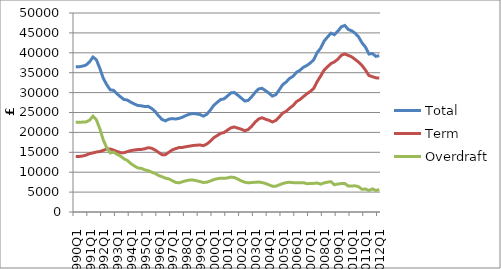
| Category | Total | Term | Overdraft |
|---|---|---|---|
| 1990Q1 | 36461.171 | 13914.215 | 22546.956 |
| 1990Q2 | 36496.002 | 13942.438 | 22553.564 |
| 1990Q3 | 36652.749 | 14069.449 | 22583.3 |
| 1990Q4 | 36931.415 | 14295.252 | 22636.163 |
| 1991Q1 | 37706.526 | 14655.279 | 23051.246 |
| 1991Q2 | 38934.619 | 14846.275 | 24088.343 |
| 1991Q3 | 38229.02 | 15078.654 | 23150.366 |
| 1991Q4 | 36060.124 | 15197.495 | 20862.629 |
| 1992Q1 | 33561.191 | 15501.479 | 18059.712 |
| 1992Q2 | 31970.143 | 15838.007 | 16132.135 |
| 1992Q3 | 30686.699 | 15852.698 | 14834.001 |
| 1992Q4 | 30566.485 | 15535.755 | 15030.73 |
| 1993Q1 | 29671.945 | 15201.987 | 14469.958 |
| 1993Q2 | 28933.29 | 14910.555 | 14022.735 |
| 1993Q3 | 28268.283 | 14899.732 | 13368.552 |
| 1993Q4 | 28120.264 | 15176.731 | 12943.532 |
| 1994Q1 | 27574.342 | 15432.082 | 12142.259 |
| 1994Q2 | 27141.53 | 15575.111 | 11566.419 |
| 1994Q3 | 26761.314 | 15698.259 | 11063.055 |
| 1994Q4 | 26687.168 | 15719.425 | 10967.743 |
| 1995Q1 | 26486.549 | 15880.271 | 10606.278 |
| 1995Q2 | 26549.503 | 16154.03 | 10395.473 |
| 1995Q3 | 26032.189 | 16024.587 | 10007.602 |
| 1995Q4 | 25279.484 | 15578.237 | 9701.246 |
| 1996Q1 | 24175.614 | 14984.075 | 9191.54 |
| 1996Q2 | 23267.737 | 14396.47 | 8871.266 |
| 1996Q3 | 22905.601 | 14408.288 | 8497.313 |
| 1996Q4 | 23330.631 | 15011.652 | 8318.979 |
| 1997Q1 | 23466.281 | 15593.296 | 7872.985 |
| 1997Q2 | 23366.439 | 15935.125 | 7431.314 |
| 1997Q3 | 23529.176 | 16208.48 | 7320.696 |
| 1997Q4 | 23846.001 | 16231.121 | 7614.88 |
| 1998Q1 | 24265.957 | 16413.43 | 7852.527 |
| 1998Q2 | 24585.567 | 16552.923 | 8032.645 |
| 1998Q3 | 24745.519 | 16709.424 | 8036.095 |
| 1998Q4 | 24639.177 | 16778.601 | 7860.576 |
| 1999Q1 | 24492.763 | 16842.437 | 7650.326 |
| 1999Q2 | 24090.18 | 16671.396 | 7418.784 |
| 1999Q3 | 24546.37 | 17068.115 | 7478.256 |
| 1999Q4 | 25557.213 | 17768.122 | 7789.091 |
| 2000Q1 | 26783.793 | 18653.932 | 8129.86 |
| 2000Q2 | 27545.556 | 19185.621 | 8359.935 |
| 2000Q3 | 28250.83 | 19750.662 | 8500.168 |
| 2000Q4 | 28429.435 | 19972.364 | 8457.07 |
| 2001Q1 | 29136.889 | 20579.154 | 8557.736 |
| 2001Q2 | 29931.606 | 21155.056 | 8776.55 |
| 2001Q3 | 30020.768 | 21365.895 | 8654.872 |
| 2001Q4 | 29344.937 | 21071.116 | 8273.821 |
| 2002Q1 | 28621.442 | 20804.241 | 7817.201 |
| 2002Q2 | 27889.461 | 20407.518 | 7481.943 |
| 2002Q3 | 28034.775 | 20720.302 | 7314.473 |
| 2002Q4 | 28960.505 | 21534.067 | 7426.438 |
| 2003Q1 | 30022.814 | 22560.774 | 7462.04 |
| 2003Q2 | 30891.655 | 23362.61 | 7529.045 |
| 2003Q3 | 31093.854 | 23687.32 | 7406.535 |
| 2003Q4 | 30494.611 | 23318.429 | 7176.181 |
| 2004Q1 | 29873.567 | 23042.317 | 6831.25 |
| 2004Q2 | 29125.818 | 22640.294 | 6485.524 |
| 2004Q3 | 29476.525 | 22998.138 | 6478.387 |
| 2004Q4 | 30691.885 | 23877.288 | 6814.598 |
| 2005Q1 | 31996.732 | 24850.683 | 7146.049 |
| 2005Q2 | 32660.033 | 25283.632 | 7376.401 |
| 2005Q3 | 33562.801 | 26087.678 | 7475.122 |
| 2005Q4 | 34103.19 | 26726.79 | 7376.4 |
| 2006Q1 | 35085.519 | 27737.149 | 7348.37 |
| 2006Q2 | 35616 | 28253 | 7363 |
| 2006Q3 | 36363 | 28988 | 7375 |
| 2006Q4 | 36814 | 29693 | 7121 |
| 2007Q1 | 37428 | 30290 | 7138 |
| 2007Q2 | 38252 | 31050 | 7202 |
| 2007Q3 | 40055 | 32766 | 7289 |
| 2007Q4 | 41169 | 34167 | 7002 |
| 2008Q1 | 42924 | 35611 | 7313 |
| 2008Q2 | 43975 | 36486 | 7489 |
| 2008Q3 | 44925 | 37304 | 7621 |
| 2008Q4 | 44549 | 37718 | 6831 |
| 2009Q1 | 45421 | 38402 | 7019 |
| 2009Q2 | 46536 | 39380 | 7156 |
| 2009Q3 | 46867 | 39706 | 7161 |
| 2009Q4 | 45878 | 39354 | 6524 |
| 2010Q1 | 45532 | 38991 | 6541 |
| 2010Q2 | 44922 | 38342 | 6580 |
| 2010Q3 | 43993 | 37649 | 6344 |
| 2010Q4 | 42502 | 36811 | 5691 |
| 2011Q1 | 41431 | 35647 | 5784 |
| 2011Q2 | 39688 | 34291 | 5397 |
| 2011Q3 | 39822 | 34000 | 5822 |
| 2011Q4 | 39105 | 33713 | 5392 |
| 2012Q1 | 39270 | 33636 | 5634 |